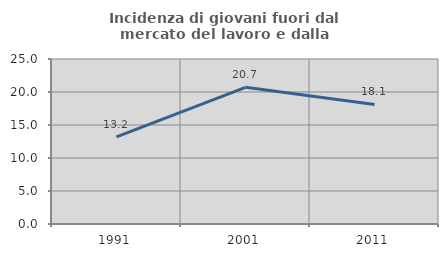
| Category | Incidenza di giovani fuori dal mercato del lavoro e dalla formazione  |
|---|---|
| 1991.0 | 13.205 |
| 2001.0 | 20.711 |
| 2011.0 | 18.123 |